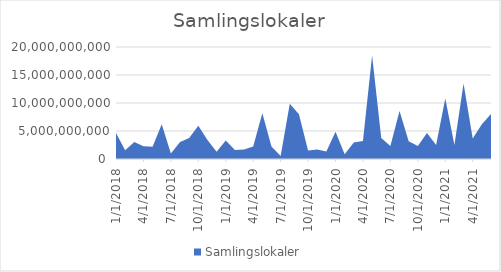
| Category | Samlingslokaler |
|---|---|
| 1/1/18 | 4654970000 |
| 2/1/18 | 1565900000 |
| 3/1/18 | 3037135000 |
| 4/1/18 | 2290040000 |
| 5/1/18 | 2171805000 |
| 6/1/18 | 6207990000 |
| 7/1/18 | 1004400000 |
| 8/1/18 | 3039300000 |
| 9/1/18 | 3747080000 |
| 10/1/18 | 5928600000 |
| 11/1/18 | 3388100000 |
| 12/1/18 | 1303600000 |
| 1/1/19 | 3284600000 |
| 2/1/19 | 1622600000 |
| 3/1/19 | 1703700000 |
| 4/1/19 | 2232000000 |
| 5/1/19 | 8164800000 |
| 6/1/19 | 2210900000 |
| 7/1/19 | 548030000 |
| 8/1/19 | 9875450000 |
| 9/1/19 | 8013000000 |
| 10/1/19 | 1531300000 |
| 11/1/19 | 1714050000 |
| 12/1/19 | 1350000000 |
| 1/1/20 | 4857600000 |
| 2/1/20 | 826750000 |
| 3/1/20 | 2951350000 |
| 4/1/20 | 3236200000 |
| 5/1/20 | 18485650000 |
| 6/1/20 | 3763750000 |
| 7/1/20 | 2302500000 |
| 8/1/20 | 8554550000 |
| 9/1/20 | 3172800000 |
| 10/1/20 | 2307800000 |
| 11/1/20 | 4647660000 |
| 12/1/20 | 2519100000 |
| 1/1/21 | 10815250000 |
| 2/1/21 | 2479350000 |
| 3/1/21 | 13460150000 |
| 4/1/21 | 3653850000 |
| 5/1/21 | 6226250000 |
| 6/1/21 | 8050250000 |